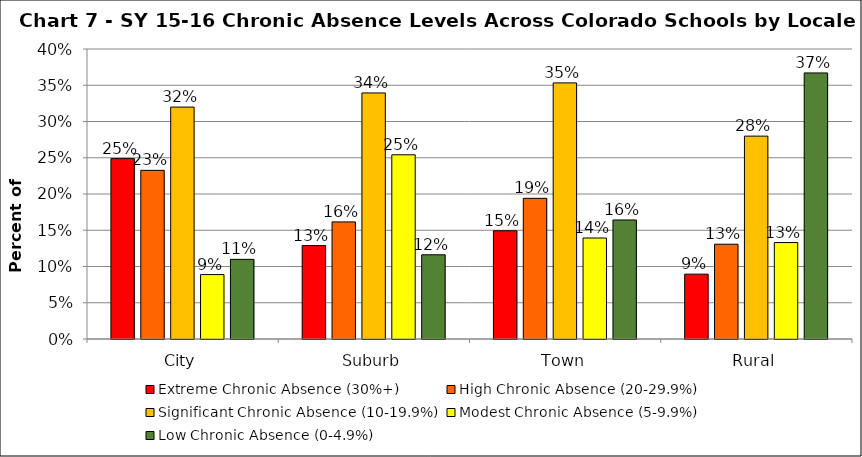
| Category | Extreme Chronic Absence (30%+) | High Chronic Absence (20-29.9%) | Significant Chronic Absence (10-19.9%) | Modest Chronic Absence (5-9.9%) | Low Chronic Absence (0-4.9%) |
|---|---|---|---|---|---|
| 0 | 0.249 | 0.233 | 0.32 | 0.089 | 0.11 |
| 1 | 0.129 | 0.162 | 0.339 | 0.254 | 0.116 |
| 2 | 0.149 | 0.194 | 0.353 | 0.139 | 0.164 |
| 3 | 0.089 | 0.131 | 0.28 | 0.133 | 0.367 |